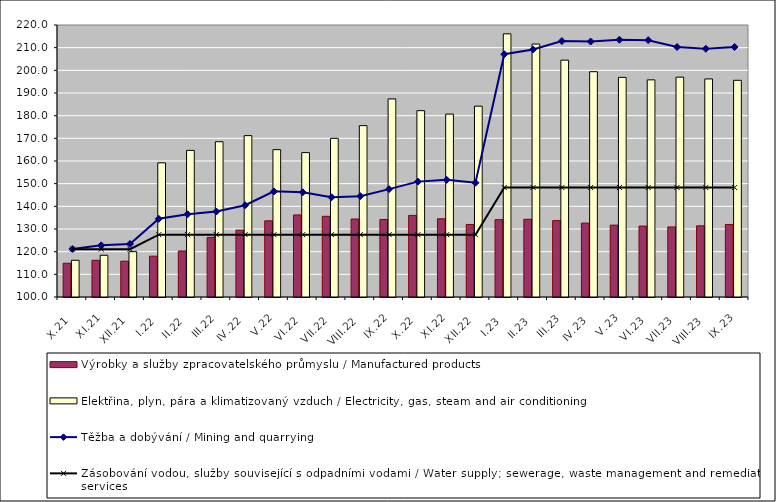
| Category | Výrobky a služby zpracovatelského průmyslu / Manufactured products | Elektřina, plyn, pára a klimatizovaný vzduch / Electricity, gas, steam and air conditioning |
|---|---|---|
| X.21 | 114.9 | 116.2 |
| XI.21 | 116.2 | 118.4 |
| XII.21 | 115.8 | 120 |
| I.22 | 118 | 159.2 |
| II.22 | 120.3 | 164.7 |
| III.22 | 126.3 | 168.5 |
| IV.22 | 129.5 | 171.2 |
| V.22 | 133.6 | 165 |
| VI.22 | 136.2 | 163.7 |
| VII.22 | 135.6 | 170 |
| VIII.22 | 134.4 | 175.6 |
| IX.22 | 134.2 | 187.4 |
| X.22 | 136 | 182.2 |
| XI.22 | 134.5 | 180.7 |
| XII.22 | 132 | 184.2 |
| I.23 | 134.1 | 216.1 |
| II.23 | 134.3 | 211.6 |
| III.23 | 133.7 | 204.5 |
| IV.23 | 132.6 | 199.4 |
| V.23 | 131.7 | 196.9 |
| VI.23 | 131.3 | 195.8 |
| VII.23 | 130.9 | 197 |
| VIII.23 | 131.4 | 196.2 |
| IX.23 | 132 | 195.6 |